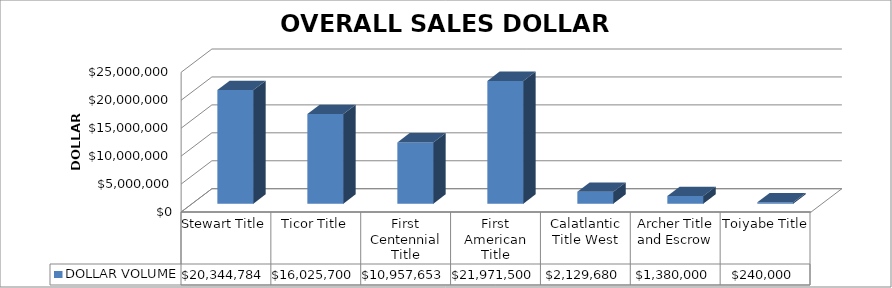
| Category | DOLLAR VOLUME |
|---|---|
| Stewart Title | 20344784 |
| Ticor Title | 16025700 |
| First Centennial Title | 10957653 |
| First American Title | 21971500 |
| Calatlantic Title West | 2129680 |
| Archer Title and Escrow | 1380000 |
| Toiyabe Title | 240000 |